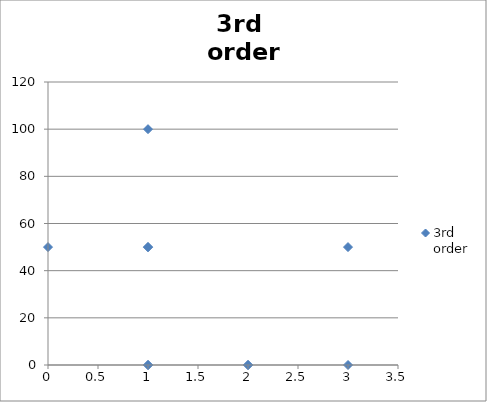
| Category | 3rd 
order |
|---|---|
| 3.0 | 50 |
| 1.0 | 100 |
| 0.0 | 50 |
| 1.0 | 50 |
| 2.0 | 0 |
| 3.0 | 0 |
| 1.0 | 50 |
| 1.0 | 0 |
| 2.0 | 0 |
| 1.0 | 0 |